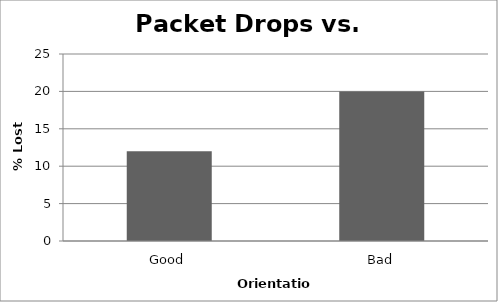
| Category | Loss % |
|---|---|
| Good | 12 |
| Bad | 20 |